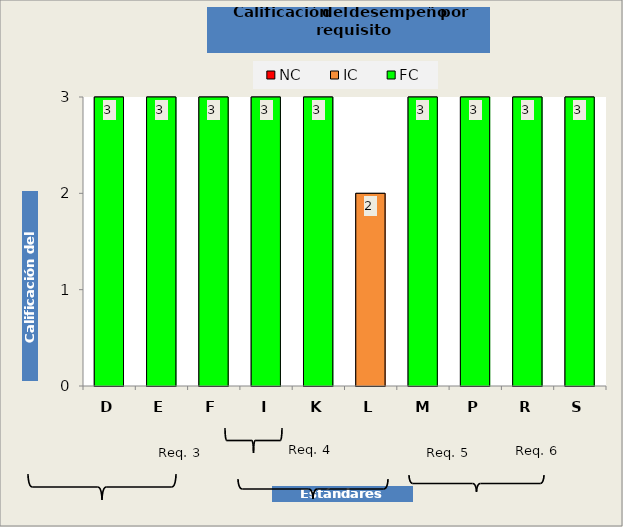
| Category | Calificación del desempeño | NC | IC | FC |
|---|---|---|---|---|
| D | 3 | 0 | 0 | 3 |
| E | 3 | 0 | 0 | 3 |
| F | 3 | 0 | 0 | 3 |
| I | 3 | 0 | 0 | 3 |
| K | 3 | 0 | 0 | 3 |
| L | 2 | 0 | 2 | 0 |
| M | 3 | 0 | 0 | 3 |
| P | 3 | 0 | 0 | 3 |
| R | 3 | 0 | 0 | 3 |
| S | 3 | 0 | 0 | 3 |